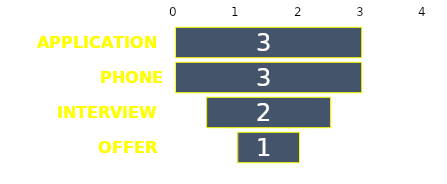
| Category | Offsetter | Series 0 |
|---|---|---|
| APPLICATION | 0 | 3 |
| PHONE SCREEN | 0 | 3 |
| INTERVIEW | 0.5 | 2 |
| OFFER | 1 | 1 |